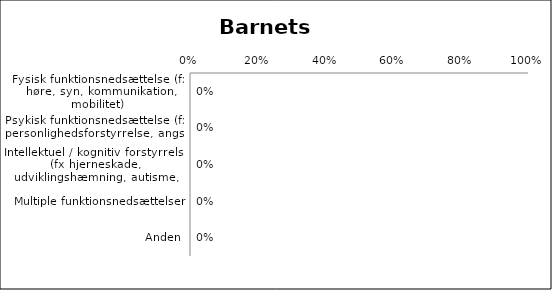
| Category | Funktionsnedsættelse |
|---|---|
| Fysisk funktionsnedsættelse (fx høre, syn, kommunikation, mobilitet) | 0 |
| Psykisk funktionsnedsættelse (fx personlighedsforstyrrelse, angst) | 0 |
| Intellektuel / kognitiv forstyrrelse (fx hjerneskade, udviklingshæmning, autisme, ADHD) | 0 |
| Multiple funktionsnedsættelser | 0 |
| Anden | 0 |